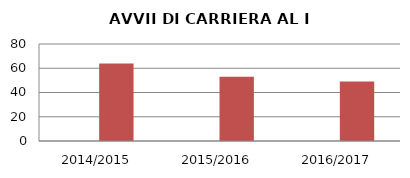
| Category | ANNO | NUMERO |
|---|---|---|
| 2014/2015 | 0 | 64 |
| 2015/2016 | 0 | 53 |
| 2016/2017 | 0 | 49 |